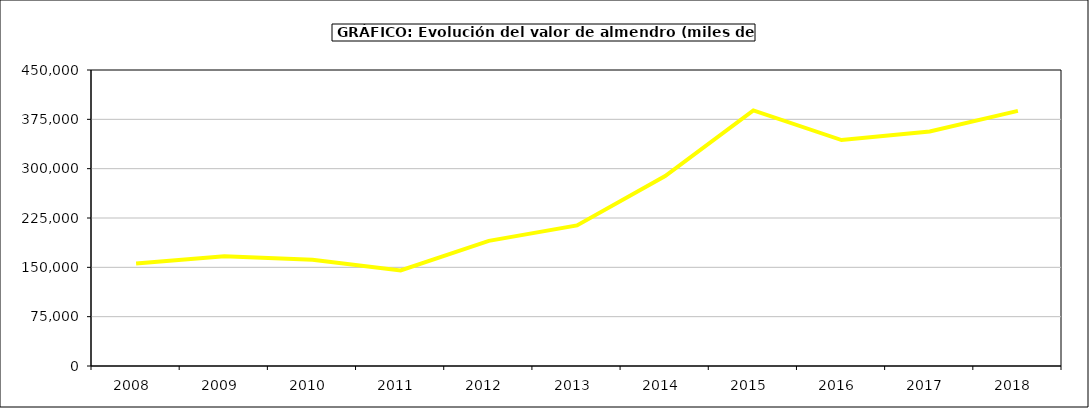
| Category | valor almendro |
|---|---|
| 2008.0 | 156005.219 |
| 2009.0 | 166823.782 |
| 2010.0 | 161485.094 |
| 2011.0 | 145270.034 |
| 2012.0 | 190305.336 |
| 2013.0 | 213791.63 |
| 2014.0 | 288832.154 |
| 2015.0 | 388475 |
| 2016.0 | 343509 |
| 2017.0 | 356619.875 |
| 2018.0 | 387785.945 |